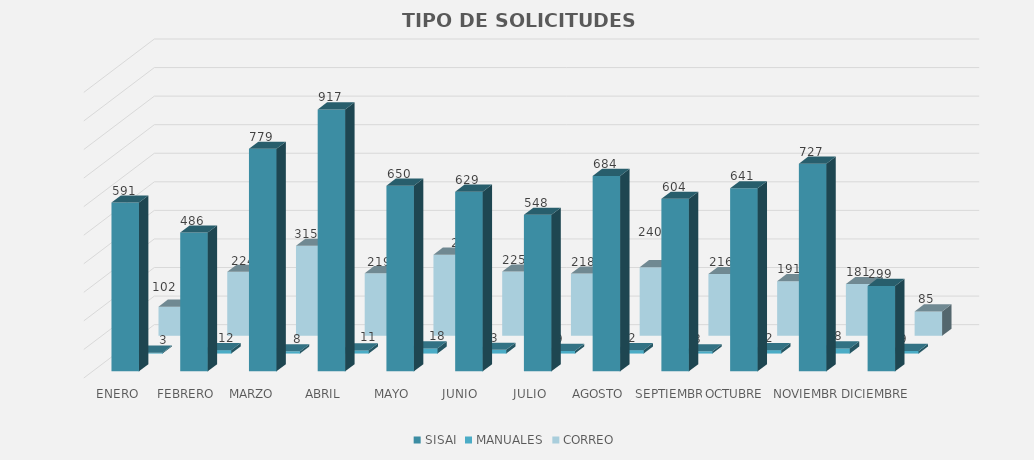
| Category | SISAI | MANUALES | CORREO |
|---|---|---|---|
| ENERO | 591 | 3 | 102 |
| FEBRERO | 486 | 12 | 224 |
| MARZO  | 779 | 8 | 315 |
| ABRIL | 917 | 11 | 219 |
| MAYO | 650 | 18 | 284 |
| JUNIO | 629 | 13 | 225 |
| JULIO | 548 | 9 | 218 |
| AGOSTO | 684 | 12 | 240 |
| SEPTIEMBRE | 604 | 8 | 216 |
| OCTUBRE | 641 | 12 | 191 |
| NOVIEMBRE | 727 | 18 | 181 |
| DICIEMBRE | 299 | 9 | 85 |